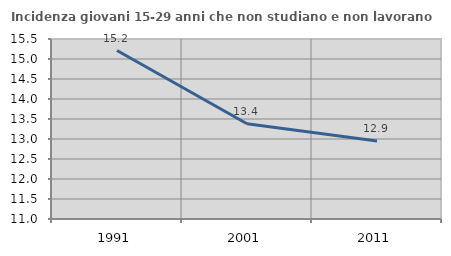
| Category | Incidenza giovani 15-29 anni che non studiano e non lavorano  |
|---|---|
| 1991.0 | 15.211 |
| 2001.0 | 13.38 |
| 2011.0 | 12.95 |